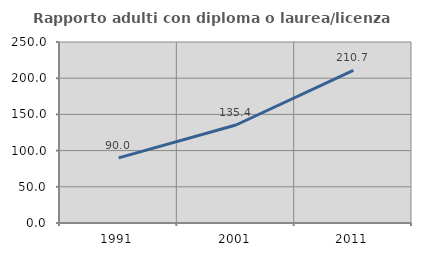
| Category | Rapporto adulti con diploma o laurea/licenza media  |
|---|---|
| 1991.0 | 89.966 |
| 2001.0 | 135.352 |
| 2011.0 | 210.671 |